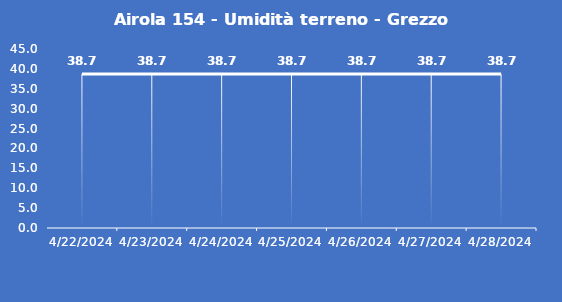
| Category | Airola 154 - Umidità terreno - Grezzo (%VWC) |
|---|---|
| 4/22/24 | 38.7 |
| 4/23/24 | 38.7 |
| 4/24/24 | 38.7 |
| 4/25/24 | 38.7 |
| 4/26/24 | 38.7 |
| 4/27/24 | 38.7 |
| 4/28/24 | 38.7 |